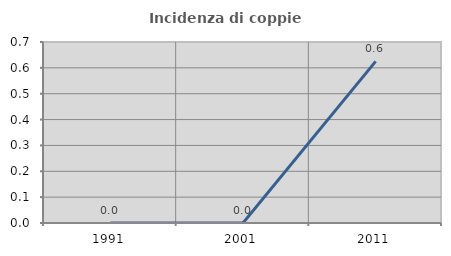
| Category | Incidenza di coppie miste |
|---|---|
| 1991.0 | 0 |
| 2001.0 | 0 |
| 2011.0 | 0.625 |